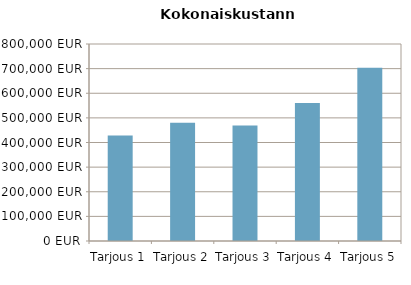
| Category | LCC YHTEENSÄ |
|---|---|
| Tarjous 1 | 428639.865 |
| Tarjous 2 | 479719.848 |
| Tarjous 3 | 468639.865 |
| Tarjous 4 | 560799.831 |
| Tarjous 5 | 704039.78 |